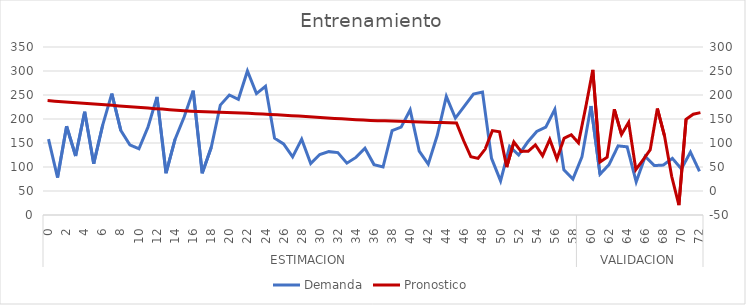
| Category | Demanda |
|---|---|
| 0 | 158 |
| 1 | 78 |
| 2 | 185 |
| 3 | 123 |
| 4 | 215 |
| 5 | 107 |
| 6 | 188 |
| 7 | 253 |
| 8 | 176 |
| 9 | 146 |
| 10 | 138 |
| 11 | 183 |
| 12 | 246 |
| 13 | 87 |
| 14 | 158 |
| 15 | 204 |
| 16 | 259 |
| 17 | 87 |
| 18 | 141 |
| 19 | 229 |
| 20 | 250 |
| 21 | 241 |
| 22 | 300 |
| 23 | 253 |
| 24 | 268 |
| 25 | 160 |
| 26 | 148 |
| 27 | 121 |
| 28 | 158 |
| 29 | 107 |
| 30 | 126 |
| 31 | 132 |
| 32 | 130 |
| 33 | 108 |
| 34 | 120 |
| 35 | 139 |
| 36 | 105 |
| 37 | 100 |
| 38 | 176 |
| 39 | 183 |
| 40 | 219 |
| 41 | 133 |
| 42 | 106 |
| 43 | 166 |
| 44 | 247 |
| 45 | 202 |
| 46 | 227 |
| 47 | 252 |
| 48 | 256 |
| 49 | 118 |
| 50 | 71 |
| 51 | 143 |
| 52 | 125 |
| 53 | 152 |
| 54 | 174 |
| 55 | 183 |
| 56 | 220 |
| 57 | 94 |
| 58 | 75 |
| 59 | 121 |
| 60 | 227 |
| 61 | 85 |
| 62 | 105 |
| 63 | 144 |
| 64 | 142 |
| 65 | 69 |
| 66 | 122 |
| 67 | 103 |
| 68 | 104 |
| 69 | 118 |
| 70 | 96 |
| 71 | 131 |
| 72 | 91 |